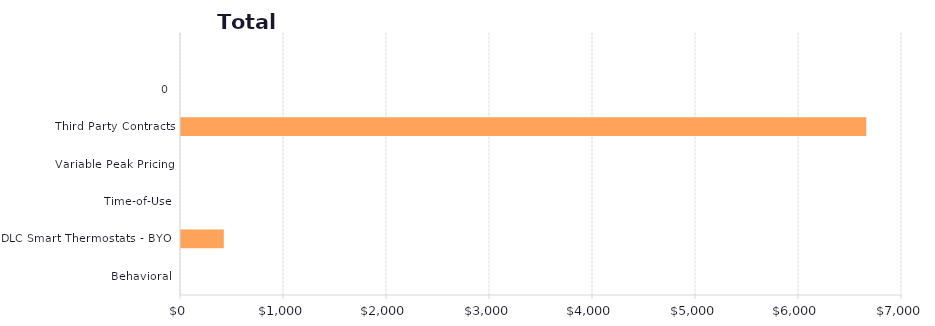
| Category | Series 1 |
|---|---|
| Behavioral | 0 |
| DLC Smart Thermostats - BYOT | 415.802 |
| Time-of-Use | 0 |
| Variable Peak Pricing | 0 |
| Third Party Contracts | 6653.166 |
| 0 | 0 |